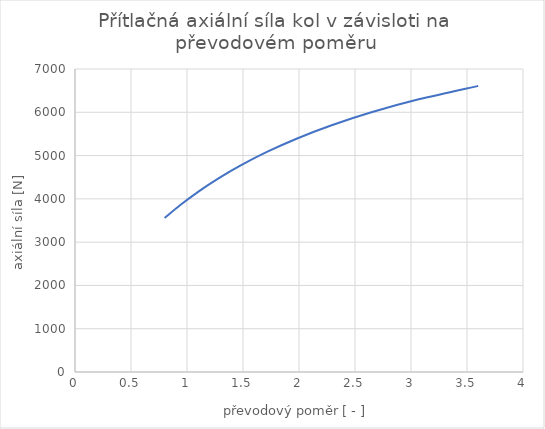
| Category | přítlačná axiální síla |
|---|---|
| 0.7999999999999998 | 3557.39 |
| 0.9429522752497227 | 3862.685 |
| 1.1023474178403756 | 4167.98 |
| 1.281195516811955 | 4473.275 |
| 1.483289124668435 | 4778.57 |
| 1.7134751773049643 | 5083.865 |
| 1.9780487804878049 | 5389.16 |
| 2.285337726523888 | 5694.455 |
| 2.646594982078853 | 5999.75 |
| 3.0774066797642443 | 6305.045 |
| 3.6000000000000005 | 6610.34 |